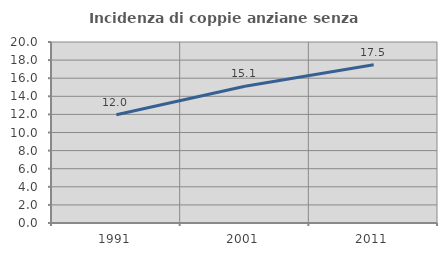
| Category | Incidenza di coppie anziane senza figli  |
|---|---|
| 1991.0 | 11.959 |
| 2001.0 | 15.119 |
| 2011.0 | 17.483 |